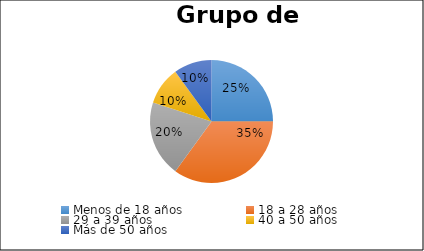
| Category | Series 0 |
|---|---|
| Menos de 18 años | 5 |
| 18 a 28 años | 7 |
| 29 a 39 años | 4 |
| 40 a 50 años | 2 |
| Más de 50 años | 2 |